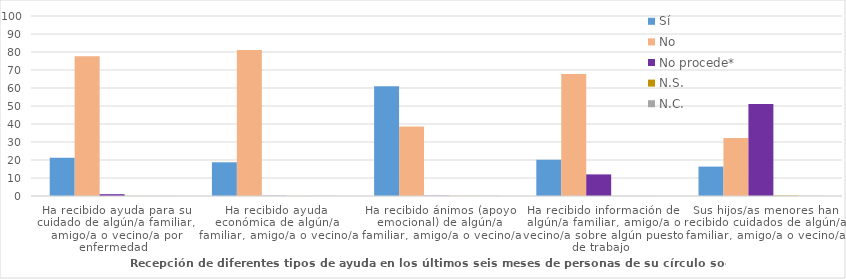
| Category | Sí | No | No procede* | N.S. | N.C. |
|---|---|---|---|---|---|
| Ha recibido ayuda para su cuidado de algún/a familiar, amigo/a o vecino/a por enfermedad | 21.249 | 77.697 | 1.014 | 0.041 | 0.041 |
| Ha recibido ayuda económica de algún/a familiar, amigo/a o vecino/a | 18.735 | 81.062 | 0.122 | 0.041 | 0.081 |
| Ha recibido ánimos (apoyo emocional) de algún/a familiar, amigo/a o vecino/a | 61.03 | 38.646 | 0.162 | 0.081 | 0.081 |
| Ha recibido información de algún/a familiar, amigo/a o vecino/a sobre algún puesto de trabajo | 20.154 | 67.802 | 12.003 | 0.041 | 0.041 |
| Sus hijos/as menores han recibido cuidados de algún/a familiar, amigo/a o vecino/a | 16.342 | 32.157 | 51.176 | 0.243 | 0.081 |